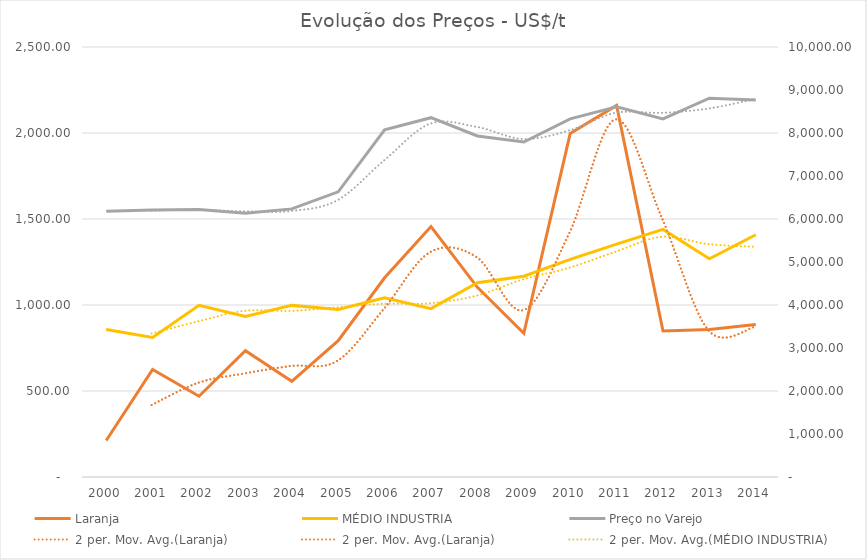
| Category | Laranja | MÉDIO INDUSTRIA |
|---|---|---|
| 2000.0 | 212.318 | 857.17 |
| 2001.0 | 624.834 | 810.904 |
| 2002.0 | 469.657 | 998.393 |
| 2003.0 | 734.431 | 933.637 |
| 2004.0 | 556.382 | 997.762 |
| 2005.0 | 792.958 | 974.206 |
| 2006.0 | 1158.008 | 1041.305 |
| 2007.0 | 1456.103 | 978.725 |
| 2008.0 | 1102.63 | 1129.333 |
| 2009.0 | 835.867 | 1167.654 |
| 2010.0 | 1997.758 | 1265.557 |
| 2011.0 | 2160.17 | 1354.249 |
| 2012.0 | 849.02 | 1439.372 |
| 2013.0 | 857.4 | 1268.735 |
| 2014.0 | 886.777 | 1408.415 |